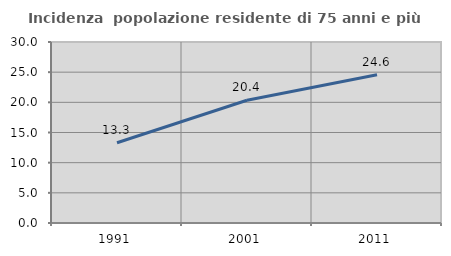
| Category | Incidenza  popolazione residente di 75 anni e più |
|---|---|
| 1991.0 | 13.295 |
| 2001.0 | 20.351 |
| 2011.0 | 24.573 |